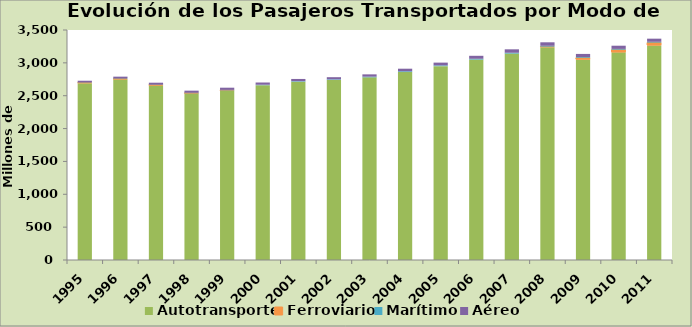
| Category | Autotransporte | Ferroviario | Marítimo | Aéreo |
|---|---|---|---|---|
| 1995.0 | 2691 | 7 | 5 | 25 |
| 1996.0 | 2750 | 7 | 6 | 27 |
| 1997.0 | 2658 | 5 | 6 | 29 |
| 1998.0 | 2536 | 2 | 8 | 31 |
| 1999.0 | 2580 | 1 | 8 | 33 |
| 2000.0 | 2660 | 0 | 7 | 34 |
| 2001.0 | 2713 | 0 | 8 | 34 |
| 2002.0 | 2740 | 0 | 9 | 33 |
| 2003.0 | 2780 | 0 | 10 | 35 |
| 2004.0 | 2860 | 0 | 12 | 39 |
| 2005.0 | 2950 | 0 | 11.461 | 42.176 |
| 2006.0 | 3050 | 0 | 11.985 | 45.406 |
| 2007.0 | 3141 | 0 | 12.761 | 52.217 |
| 2008.0 | 3238 | 8.915 | 12.597 | 53.3 |
| 2009.0 | 3050 | 28 | 10.985 | 46.971 |
| 2010.0 | 3160 | 40.398 | 11.799 | 48.698 |
| 2011.0 | 3264.3 | 44.397 | 11.681 | 47.705 |